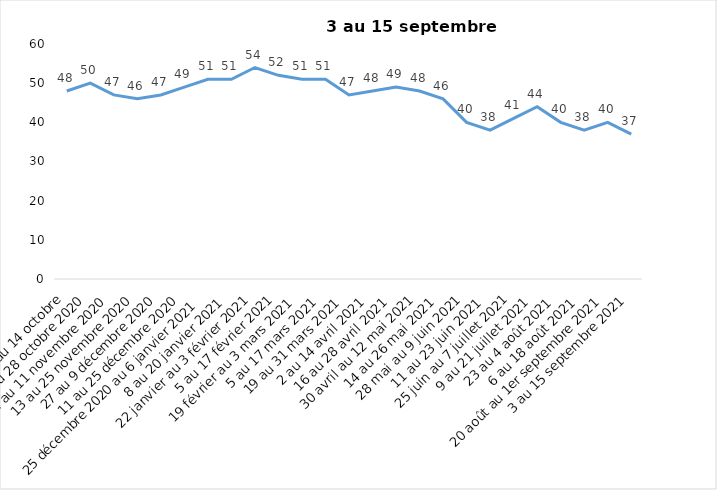
| Category | Toujours aux trois mesures |
|---|---|
| 2 au 14 octobre | 48 |
| 16 au 28 octobre 2020 | 50 |
| 30 octobre au 11 novembre 2020 | 47 |
| 13 au 25 novembre 2020 | 46 |
| 27 au 9 décembre 2020 | 47 |
| 11 au 25 décembre 2020 | 49 |
| 25 décembre 2020 au 6 janvier 2021 | 51 |
| 8 au 20 janvier 2021 | 51 |
| 22 janvier au 3 février 2021 | 54 |
| 5 au 17 février 2021 | 52 |
| 19 février au 3 mars 2021 | 51 |
| 5 au 17 mars 2021 | 51 |
| 19 au 31 mars 2021 | 47 |
| 2 au 14 avril 2021 | 48 |
| 16 au 28 avril 2021 | 49 |
| 30 avril au 12 mai 2021 | 48 |
| 14 au 26 mai 2021 | 46 |
| 28 mai au 9 juin 2021 | 40 |
| 11 au 23 juin 2021 | 38 |
| 25 juin au 7 juillet 2021 | 41 |
| 9 au 21 juillet 2021 | 44 |
| 23 au 4 août 2021 | 40 |
| 6 au 18 août 2021 | 38 |
| 20 août au 1er septembre 2021 | 40 |
| 3 au 15 septembre 2021 | 37 |